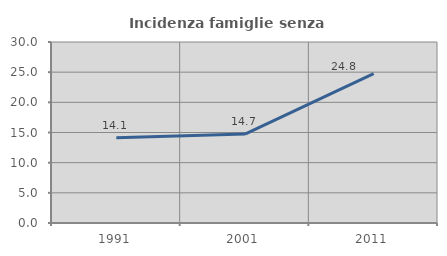
| Category | Incidenza famiglie senza nuclei |
|---|---|
| 1991.0 | 14.148 |
| 2001.0 | 14.739 |
| 2011.0 | 24.76 |